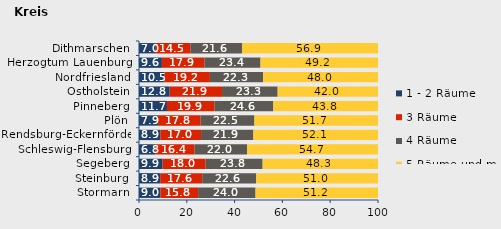
| Category | 1 - 2 Räume | 3 Räume | 4 Räume | 5 Räume und mehr |
|---|---|---|---|---|
| Stormarn | 8.979 | 15.754 | 24.026 | 51.242 |
| Steinburg | 8.868 | 17.58 | 22.569 | 50.983 |
| Segeberg | 9.855 | 18.028 | 23.826 | 48.29 |
| Schleswig-Flensburg | 6.785 | 16.447 | 22.026 | 54.742 |
| Rendsburg-Eckernförde | 8.944 | 17.021 | 21.896 | 52.139 |
| Plön | 7.942 | 17.816 | 22.53 | 51.713 |
| Pinneberg | 11.702 | 19.907 | 24.605 | 43.786 |
| Ostholstein | 12.841 | 21.899 | 23.272 | 41.988 |
| Nordfriesland | 10.509 | 19.162 | 22.285 | 48.044 |
| Herzogtum Lauenburg | 9.58 | 17.857 | 23.4 | 49.163 |
| Dithmarschen | 7.02 | 14.504 | 21.568 | 56.908 |